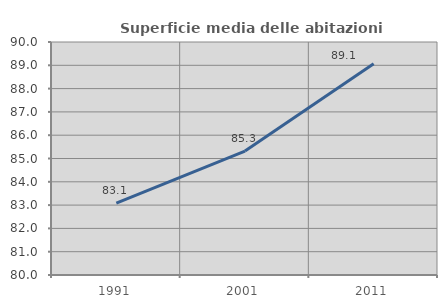
| Category | Superficie media delle abitazioni occupate |
|---|---|
| 1991.0 | 83.081 |
| 2001.0 | 85.319 |
| 2011.0 | 89.067 |